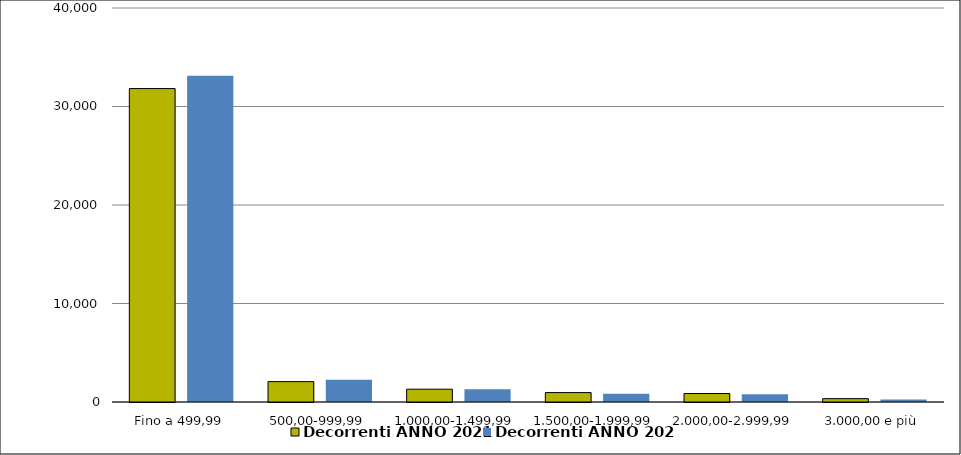
| Category | Decorrenti ANNO 2021 | Decorrenti ANNO 2020 |
|---|---|---|
|  Fino a 499,99  | 31821 | 33133 |
|  500,00-999,99  | 2067 | 2264 |
|  1.000,00-1.499,99  | 1300 | 1304 |
|  1.500,00-1.999,99  | 955 | 839 |
|  2.000,00-2.999,99  | 862 | 786 |
|  3.000,00 e più  | 340 | 266 |